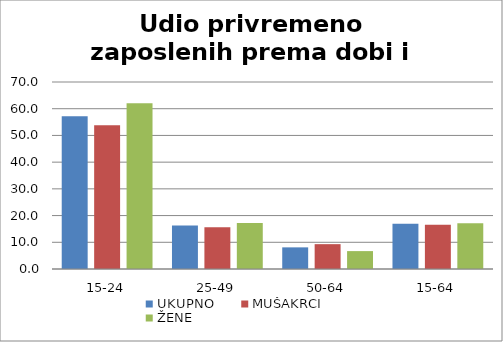
| Category | UKUPNO | MUŠAKRCI | ŽENE |
|---|---|---|---|
| 15-24 | 57.2 | 53.8 | 62 |
| 25-49 | 16.3 | 15.6 | 17.2 |
| 50-64 | 8.1 | 9.3 | 6.7 |
| 15-64 | 16.9 | 16.6 | 17.1 |